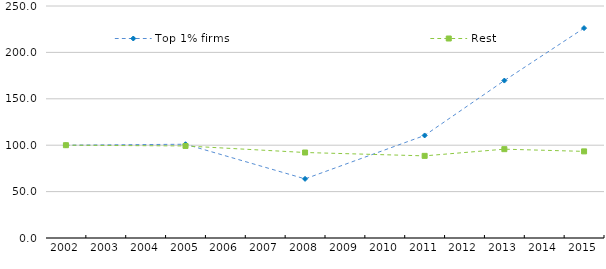
| Category | Top 1% firms | Rest |
|---|---|---|
| 2002.0 | 100 | 100 |
| 2005.0 | 101.03 | 99.198 |
| 2008.0 | 63.714 | 92.127 |
| 2011.0 | 110.503 | 88.509 |
| 2013.0 | 169.652 | 95.724 |
| 2015.0 | 226.179 | 93.335 |